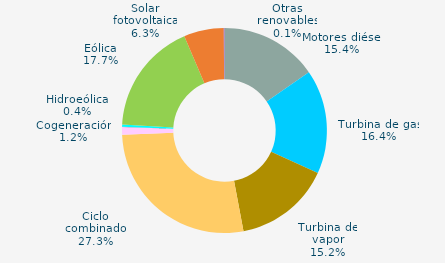
| Category | Series 0 |
|---|---|
| Motores diésel | 15.381 |
| Turbina de gas | 16.425 |
| Turbina de vapor | 15.223 |
| Ciclo combinado | 27.296 |
| Cogeneración | 1.205 |
| Hidráulica | 0.048 |
| Hidroeólica | 0.357 |
| Eólica | 17.654 |
| Solar fotovoltaica | 6.295 |
| Otras renovables | 0.117 |